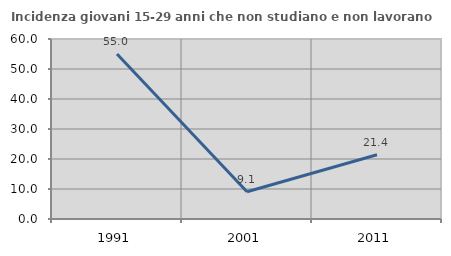
| Category | Incidenza giovani 15-29 anni che non studiano e non lavorano  |
|---|---|
| 1991.0 | 54.984 |
| 2001.0 | 9.091 |
| 2011.0 | 21.429 |